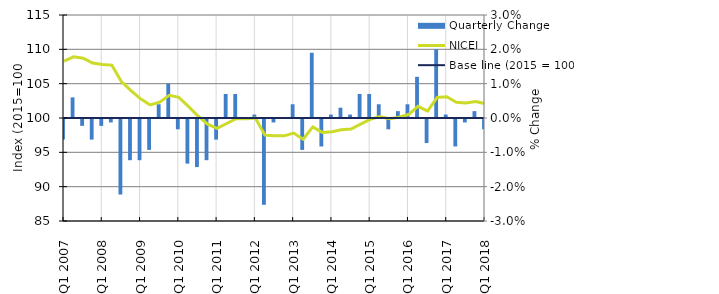
| Category | Quarterly Change |
|---|---|
| Q1 2007 | -0.006 |
|  | 0.006 |
|  | -0.002 |
|  | -0.006 |
| Q1 2008 | -0.002 |
|  | -0.001 |
|  | -0.022 |
|  | -0.012 |
| Q1 2009 | -0.012 |
|  | -0.009 |
|  | 0.004 |
|  | 0.01 |
| Q1 2010 | -0.003 |
|  | -0.013 |
|  | -0.014 |
|  | -0.012 |
| Q1 2011 | -0.006 |
|  | 0.007 |
|  | 0.007 |
|  | 0 |
| Q1 2012 | 0.001 |
|  | -0.025 |
|  | -0.001 |
|  | 0 |
| Q1 2013 | 0.004 |
|  | -0.009 |
|  | 0.019 |
|  | -0.008 |
| Q1 2014 | 0.001 |
|  | 0.003 |
|  | 0.001 |
|  | 0.007 |
| Q1 2015 | 0.007 |
|  | 0.004 |
|  | -0.003 |
|  | 0.002 |
| Q1 2016 | 0.004 |
|  | 0.012 |
|  | -0.007 |
|  | 0.02 |
| Q1 2017 | 0.001 |
|  | -0.008 |
|  | -0.001 |
|  | 0.002 |
| Q1 2018 | -0.003 |